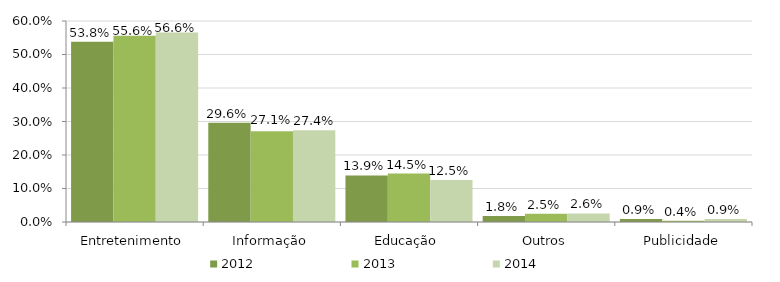
| Category | 2012 | 2013 | 2014 |
|---|---|---|---|
| Entretenimento | 0.538 | 0.556 | 0.566 |
| Informação | 0.296 | 0.271 | 0.274 |
| Educação | 0.139 | 0.145 | 0.125 |
| Outros | 0.018 | 0.025 | 0.026 |
| Publicidade | 0.009 | 0.004 | 0.009 |